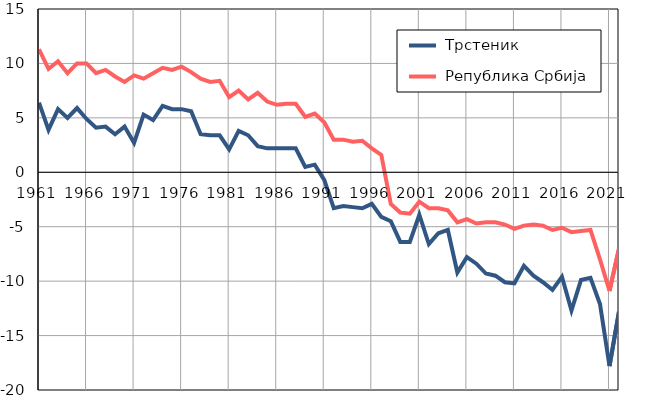
| Category |  Трстеник |  Република Србија |
|---|---|---|
| 1961.0 | 6.4 | 11.3 |
| 1962.0 | 3.9 | 9.5 |
| 1963.0 | 5.8 | 10.2 |
| 1964.0 | 5 | 9.1 |
| 1965.0 | 5.9 | 10 |
| 1966.0 | 4.9 | 10 |
| 1967.0 | 4.1 | 9.1 |
| 1968.0 | 4.2 | 9.4 |
| 1969.0 | 3.5 | 8.8 |
| 1970.0 | 4.2 | 8.3 |
| 1971.0 | 2.7 | 8.9 |
| 1972.0 | 5.3 | 8.6 |
| 1973.0 | 4.8 | 9.1 |
| 1974.0 | 6.1 | 9.6 |
| 1975.0 | 5.8 | 9.4 |
| 1976.0 | 5.8 | 9.7 |
| 1977.0 | 5.6 | 9.2 |
| 1978.0 | 3.5 | 8.6 |
| 1979.0 | 3.4 | 8.3 |
| 1980.0 | 3.4 | 8.4 |
| 1981.0 | 2.1 | 6.9 |
| 1982.0 | 3.8 | 7.5 |
| 1983.0 | 3.4 | 6.7 |
| 1984.0 | 2.4 | 7.3 |
| 1985.0 | 2.2 | 6.5 |
| 1986.0 | 2.2 | 6.2 |
| 1987.0 | 2.2 | 6.3 |
| 1988.0 | 2.2 | 6.3 |
| 1989.0 | 0.5 | 5.1 |
| 1990.0 | 0.7 | 5.4 |
| 1991.0 | -0.7 | 4.6 |
| 1992.0 | -3.3 | 3 |
| 1993.0 | -3.1 | 3 |
| 1994.0 | -3.2 | 2.8 |
| 1995.0 | -3.3 | 2.9 |
| 1996.0 | -2.9 | 2.2 |
| 1997.0 | -4.1 | 1.6 |
| 1998.0 | -4.5 | -2.9 |
| 1999.0 | -6.4 | -3.7 |
| 2000.0 | -6.4 | -3.8 |
| 2001.0 | -3.9 | -2.7 |
| 2002.0 | -6.6 | -3.3 |
| 2003.0 | -5.6 | -3.3 |
| 2004.0 | -5.3 | -3.5 |
| 2005.0 | -9.2 | -4.6 |
| 2006.0 | -7.8 | -4.3 |
| 2007.0 | -8.4 | -4.7 |
| 2008.0 | -9.3 | -4.6 |
| 2009.0 | -9.5 | -4.6 |
| 2010.0 | -10.1 | -4.8 |
| 2011.0 | -10.2 | -5.2 |
| 2012.0 | -8.6 | -4.9 |
| 2013.0 | -9.5 | -4.8 |
| 2014.0 | -10.1 | -4.9 |
| 2015.0 | -10.8 | -5.3 |
| 2016.0 | -9.6 | -5.1 |
| 2017.0 | -12.7 | -5.5 |
| 2018.0 | -9.9 | -5.4 |
| 2019.0 | -9.7 | -5.3 |
| 2020.0 | -12.1 | -8 |
| 2021.0 | -17.8 | -10.9 |
| 2022.0 | -12.8 | -7 |